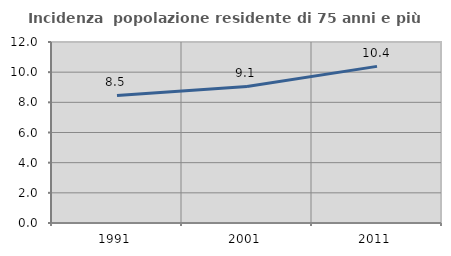
| Category | Incidenza  popolazione residente di 75 anni e più |
|---|---|
| 1991.0 | 8.458 |
| 2001.0 | 9.05 |
| 2011.0 | 10.385 |